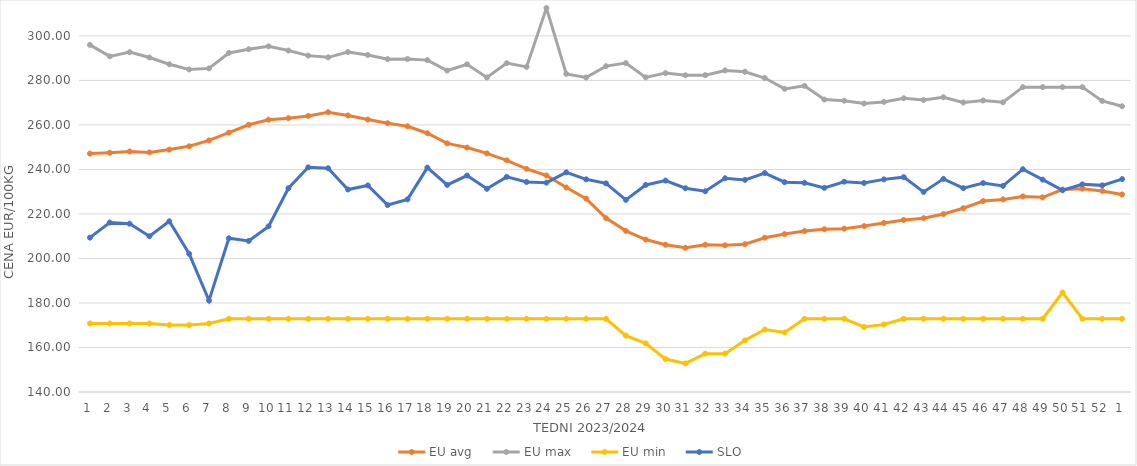
| Category | EU avg | EU max | EU min | SLO |
|---|---|---|---|---|
| 1.0 | 247.118 | 295.98 | 170.79 | 209.37 |
| 2.0 | 247.516 | 290.8 | 170.79 | 216.15 |
| 3.0 | 248.079 | 292.71 | 170.79 | 215.63 |
| 4.0 | 247.672 | 290.32 | 170.79 | 210 |
| 5.0 | 248.924 | 287.27 | 170.09 | 216.7 |
| 6.0 | 250.4 | 284.92 | 170.09 | 202.1 |
| 7.0 | 253.074 | 285.42 | 170.79 | 181.11 |
| 8.0 | 256.543 | 292.35 | 172.91 | 209.08 |
| 9.0 | 260.066 | 294.02 | 172.91 | 207.87 |
| 10.0 | 262.352 | 295.33 | 172.91 | 214.42 |
| 11.0 | 263.049 | 293.44 | 172.91 | 231.56 |
| 12.0 | 264.068 | 291.15 | 172.91 | 240.97 |
| 13.0 | 265.73 | 290.38 | 172.91 | 240.55 |
| 14.0 | 264.262 | 292.763 | 172.91 | 230.99 |
| 15.0 | 262.411 | 291.46 | 172.91 | 232.82 |
| 16.0 | 260.77 | 289.56 | 172.91 | 224 |
| 17.0 | 259.395 | 289.61 | 172.91 | 226.57 |
| 18.0 | 256.275 | 289.13 | 172.91 | 240.83 |
| 19.0 | 251.716 | 284.45 | 172.91 | 233.05 |
| 20.0 | 249.836 | 287.26 | 172.91 | 237.25 |
| 21.0 | 247.212 | 281.33 | 172.91 | 231.3 |
| 22.0 | 244.103 | 287.77 | 172.91 | 236.67 |
| 23.0 | 240.279 | 286.1 | 172.91 | 234.39 |
| 24.0 | 237.289 | 312.54 | 172.91 | 234.08 |
| 25.0 | 231.895 | 282.95 | 172.91 | 238.69 |
| 26.0 | 226.903 | 281.34 | 172.91 | 235.57 |
| 27.0 | 218.126 | 286.43 | 172.91 | 233.75 |
| 28.0 | 212.406 | 287.8 | 165.32 | 226.35 |
| 29.0 | 208.504 | 281.37 | 161.87 | 233.03 |
| 30.0 | 206.149 | 283.3 | 154.8 | 235 |
| 31.0 | 204.79 | 282.32 | 152.83 | 231.55 |
| 32.0 | 206.16 | 282.36 | 157.23 | 230.2 |
| 33.0 | 205.917 | 284.5 | 157.23 | 236.04 |
| 34.0 | 206.436 | 283.9 | 163.21 | 235.32 |
| 35.0 | 209.326 | 281.09 | 168.085 | 238.39 |
| 36.0 | 210.957 | 276.21 | 166.745 | 234.27 |
| 37.0 | 212.325 | 277.59 | 172.91 | 234 |
| 38.0 | 213.132 | 271.4 | 172.91 | 231.74 |
| 39.0 | 213.398 | 270.91 | 172.91 | 234.5 |
| 40.0 | 214.548 | 269.62 | 169.209 | 233.92 |
| 41.0 | 215.966 | 270.36 | 170.387 | 235.54 |
| 42.0 | 217.294 | 271.99 | 172.91 | 236.54 |
| 43.0 | 218.091 | 271.22 | 172.91 | 229.92 |
| 44.0 | 219.965 | 272.45 | 172.91 | 235.77 |
| 45.0 | 222.584 | 270.09 | 172.91 | 231.6 |
| 46.0 | 225.795 | 270.99 | 172.91 | 233.89 |
| 47.0 | 226.547 | 270.18 | 172.91 | 232.62 |
| 48.0 | 227.89 | 276.99 | 172.91 | 240.11 |
| 49.0 | 227.466 | 276.99 | 172.91 | 235.41 |
| 50.0 | 230.959 | 276.99 | 184.72 | 230.65 |
| 51.0 | 231.331 | 276.99 | 172.91 | 233.3 |
| 52.0 | 230.35 | 270.79 | 172.91 | 232.85 |
| 1.0 | 228.766 | 268.42 | 172.91 | 235.66 |